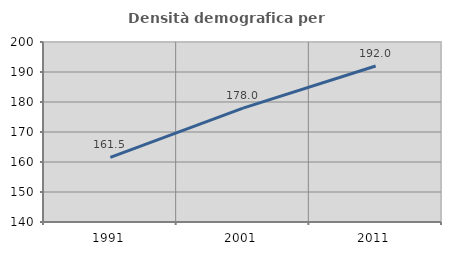
| Category | Densità demografica |
|---|---|
| 1991.0 | 161.546 |
| 2001.0 | 177.97 |
| 2011.0 | 191.983 |